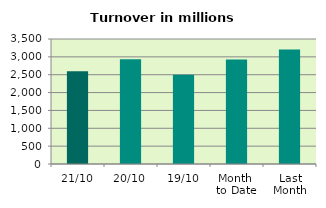
| Category | Series 0 |
|---|---|
| 21/10 | 2598.841 |
| 20/10 | 2930.793 |
| 19/10 | 2499.859 |
| Month 
to Date | 2926.002 |
| Last
Month | 3204.516 |